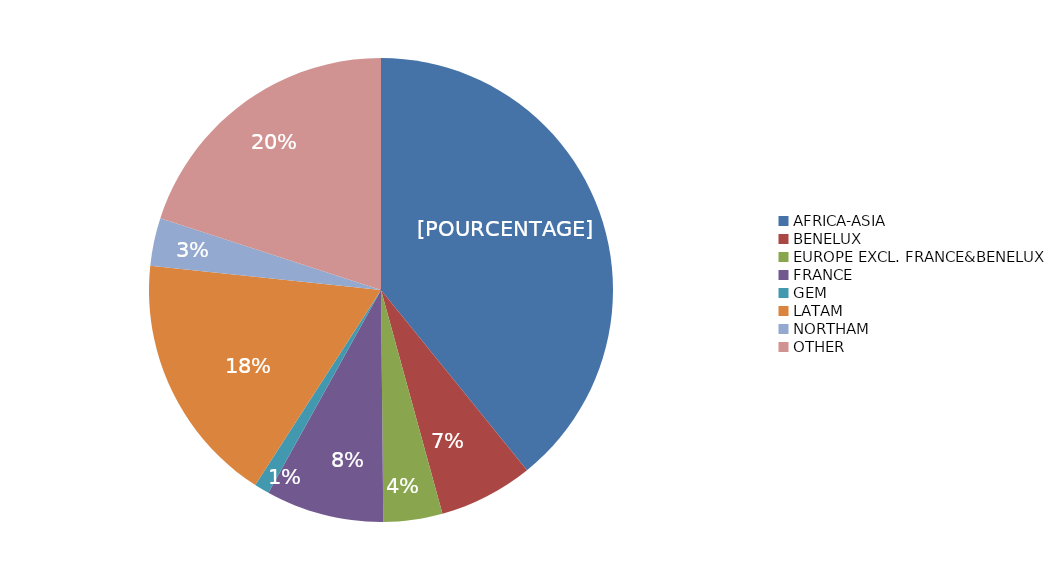
| Category | Somme de Capa. MW 100% | Somme de Capa. MW % conso | Somme de Capa MW Net owners. |
|---|---|---|---|
| AFRICA-ASIA | 40849.523 | 16114.108 | 14458.701 |
| BENELUX | 6851.03 | 6752.23 | 6734.08 |
| EUROPE EXCL. FRANCE&BENELUX | 4285.905 | 3757.934 | 3105.242 |
| FRANCE | 8576.931 | 7289.439 | 5427.6 |
| GEM | 1100 | 1100 | 1100 |
| LATAM | 18309.667 | 14021.748 | 9766 |
| NORTHAM | 3463.767 | 1814.452 | 1726.824 |
| OTHER | 20864.911 | 17659.257 | 17232.777 |